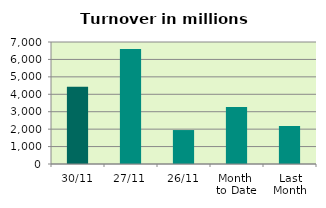
| Category | Series 0 |
|---|---|
| 30/11 | 4426.2 |
| 27/11 | 6597.135 |
| 26/11 | 1948.219 |
| Month 
to Date | 3273.817 |
| Last
Month | 2179.795 |